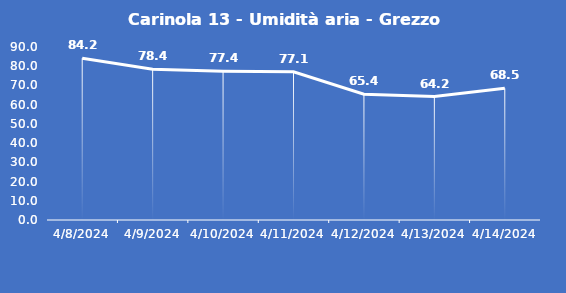
| Category | Carinola 13 - Umidità aria - Grezzo (%) |
|---|---|
| 4/8/24 | 84.2 |
| 4/9/24 | 78.4 |
| 4/10/24 | 77.4 |
| 4/11/24 | 77.1 |
| 4/12/24 | 65.4 |
| 4/13/24 | 64.2 |
| 4/14/24 | 68.5 |